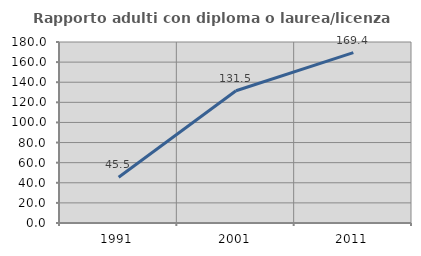
| Category | Rapporto adulti con diploma o laurea/licenza media  |
|---|---|
| 1991.0 | 45.455 |
| 2001.0 | 131.469 |
| 2011.0 | 169.427 |